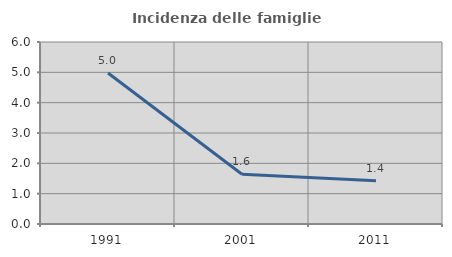
| Category | Incidenza delle famiglie numerose |
|---|---|
| 1991.0 | 4.978 |
| 2001.0 | 1.638 |
| 2011.0 | 1.427 |